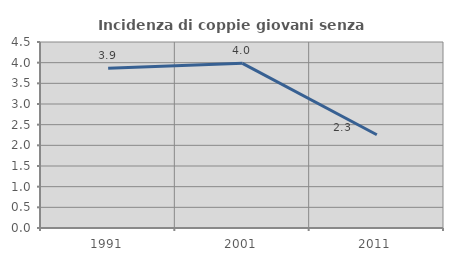
| Category | Incidenza di coppie giovani senza figli |
|---|---|
| 1991.0 | 3.863 |
| 2001.0 | 3.984 |
| 2011.0 | 2.256 |